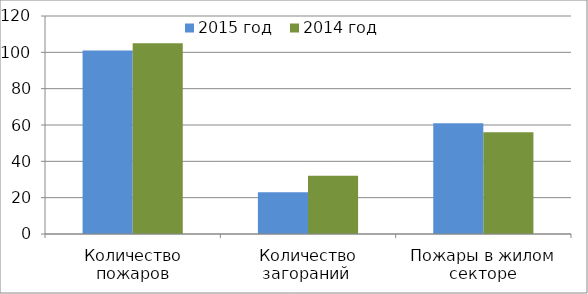
| Category | 2015 год | 2014 год |
|---|---|---|
| Количество пожаров | 101 | 105 |
| Количество загораний  | 23 | 32 |
| Пожары в жилом секторе | 61 | 56 |